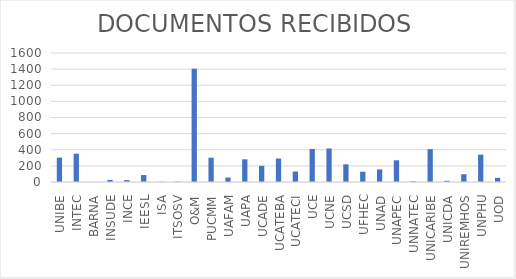
| Category | Series 0 |
|---|---|
| UNIBE | 302 |
| INTEC | 351 |
| BARNA | 1 |
| INSUDE | 26 |
| INCE | 23 |
| IEESL | 86 |
| ISA | 3 |
| ITSOSV | 5 |
| O&M | 1405 |
| PUCMM | 301 |
| UAFAM | 55 |
| UAPA | 282 |
| UCADE | 200 |
| UCATEBA | 291 |
| UCATECI | 130 |
| UCE | 410 |
| UCNE | 416 |
| UCSD | 219 |
| UFHEC | 128 |
| UNAD | 156 |
| UNAPEC | 269 |
| UNNATEC | 8 |
| UNICARIBE | 408 |
| UNICDA | 15 |
| UNIREMHOS | 96 |
| UNPHU | 339 |
| UOD | 52 |